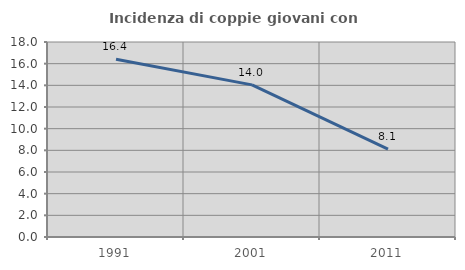
| Category | Incidenza di coppie giovani con figli |
|---|---|
| 1991.0 | 16.406 |
| 2001.0 | 14.043 |
| 2011.0 | 8.108 |